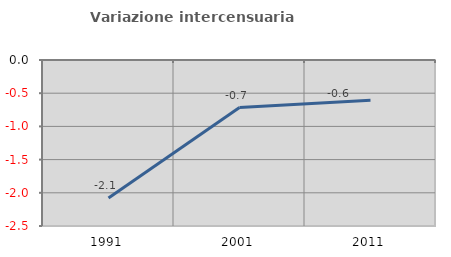
| Category | Variazione intercensuaria annua |
|---|---|
| 1991.0 | -2.08 |
| 2001.0 | -0.717 |
| 2011.0 | -0.608 |